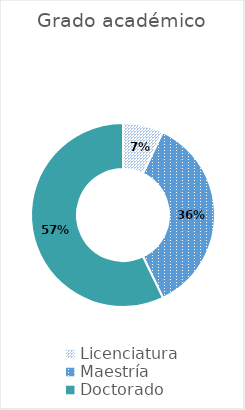
| Category | Series 1 |
|---|---|
| Licenciatura | 0.071 |
| Maestría  | 0.357 |
| Doctorado | 0.571 |